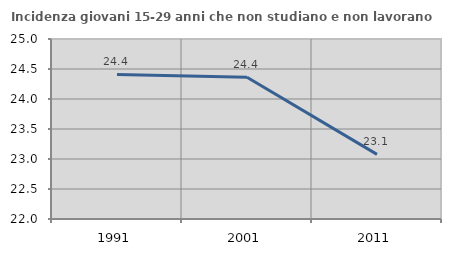
| Category | Incidenza giovani 15-29 anni che non studiano e non lavorano  |
|---|---|
| 1991.0 | 24.409 |
| 2001.0 | 24.364 |
| 2011.0 | 23.077 |